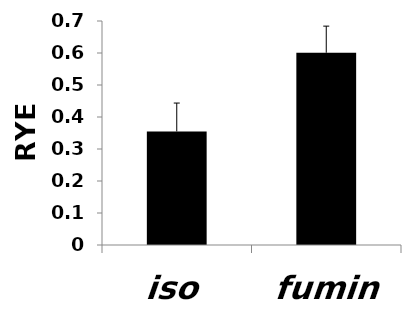
| Category | Series 0 |
|---|---|
| iso | 0.355 |
| fumin | 0.601 |